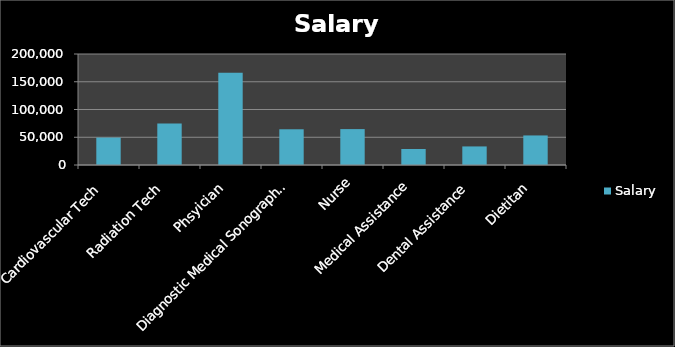
| Category | Salary |
|---|---|
| Cardiovascular Tech  | 49410 |
| Radiation Tech  | 74980 |
| Phsyician  | 166400 |
| Diagnostic Medical Sonographer  | 64380 |
| Nurse | 64690 |
| Medical Assistance  | 28860 |
| Dental Assistance  | 33470 |
| Dietitan  | 53250 |